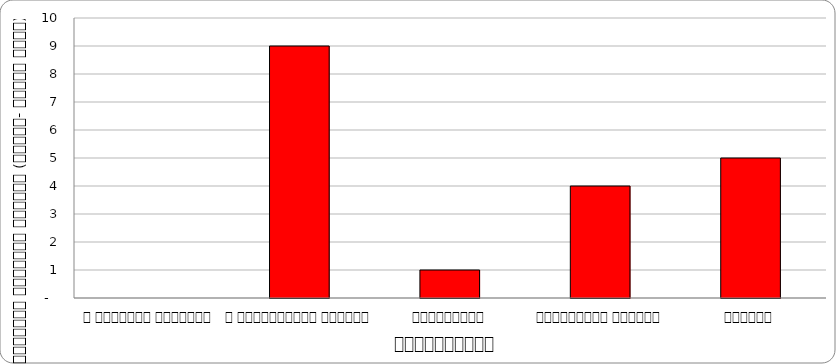
| Category | अर्थतन्त्र |
|---|---|
| द हिमालयन टाइम्स् | 0 |
| द काठमाण्डौं पोस्ट् | 9 |
| कान्तिपुर | 1 |
| अन्नपूर्ण पोस्ट् | 4 |
| नागरिक | 5 |